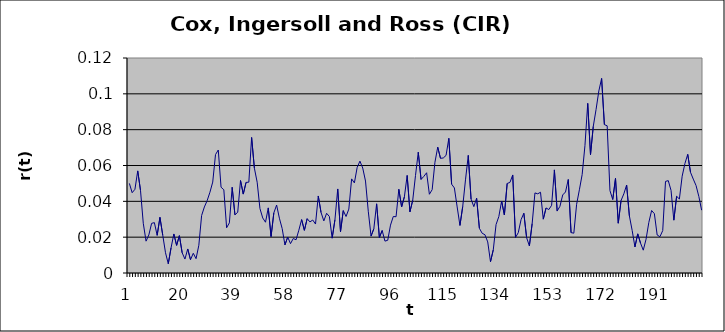
| Category | Series 0 |
|---|---|
| 0 | 0.05 |
| 1 | 0.045 |
| 2 | 0.047 |
| 3 | 0.057 |
| 4 | 0.046 |
| 5 | 0.028 |
| 6 | 0.018 |
| 7 | 0.021 |
| 8 | 0.028 |
| 9 | 0.028 |
| 10 | 0.021 |
| 11 | 0.031 |
| 12 | 0.021 |
| 13 | 0.011 |
| 14 | 0.005 |
| 15 | 0.014 |
| 16 | 0.022 |
| 17 | 0.015 |
| 18 | 0.021 |
| 19 | 0.011 |
| 20 | 0.008 |
| 21 | 0.013 |
| 22 | 0.007 |
| 23 | 0.011 |
| 24 | 0.008 |
| 25 | 0.015 |
| 26 | 0.032 |
| 27 | 0.037 |
| 28 | 0.04 |
| 29 | 0.045 |
| 30 | 0.051 |
| 31 | 0.066 |
| 32 | 0.069 |
| 33 | 0.048 |
| 34 | 0.046 |
| 35 | 0.025 |
| 36 | 0.028 |
| 37 | 0.048 |
| 38 | 0.032 |
| 39 | 0.034 |
| 40 | 0.052 |
| 41 | 0.044 |
| 42 | 0.051 |
| 43 | 0.051 |
| 44 | 0.076 |
| 45 | 0.059 |
| 46 | 0.051 |
| 47 | 0.036 |
| 48 | 0.031 |
| 49 | 0.028 |
| 50 | 0.036 |
| 51 | 0.02 |
| 52 | 0.034 |
| 53 | 0.038 |
| 54 | 0.031 |
| 55 | 0.025 |
| 56 | 0.016 |
| 57 | 0.02 |
| 58 | 0.016 |
| 59 | 0.019 |
| 60 | 0.019 |
| 61 | 0.024 |
| 62 | 0.03 |
| 63 | 0.024 |
| 64 | 0.03 |
| 65 | 0.029 |
| 66 | 0.03 |
| 67 | 0.027 |
| 68 | 0.043 |
| 69 | 0.034 |
| 70 | 0.029 |
| 71 | 0.033 |
| 72 | 0.032 |
| 73 | 0.019 |
| 74 | 0.03 |
| 75 | 0.047 |
| 76 | 0.023 |
| 77 | 0.035 |
| 78 | 0.032 |
| 79 | 0.036 |
| 80 | 0.053 |
| 81 | 0.05 |
| 82 | 0.059 |
| 83 | 0.062 |
| 84 | 0.059 |
| 85 | 0.051 |
| 86 | 0.034 |
| 87 | 0.021 |
| 88 | 0.025 |
| 89 | 0.039 |
| 90 | 0.02 |
| 91 | 0.024 |
| 92 | 0.018 |
| 93 | 0.018 |
| 94 | 0.027 |
| 95 | 0.032 |
| 96 | 0.031 |
| 97 | 0.047 |
| 98 | 0.037 |
| 99 | 0.042 |
| 100 | 0.054 |
| 101 | 0.034 |
| 102 | 0.041 |
| 103 | 0.054 |
| 104 | 0.067 |
| 105 | 0.052 |
| 106 | 0.054 |
| 107 | 0.056 |
| 108 | 0.044 |
| 109 | 0.047 |
| 110 | 0.062 |
| 111 | 0.07 |
| 112 | 0.064 |
| 113 | 0.064 |
| 114 | 0.066 |
| 115 | 0.075 |
| 116 | 0.05 |
| 117 | 0.047 |
| 118 | 0.037 |
| 119 | 0.027 |
| 120 | 0.037 |
| 121 | 0.052 |
| 122 | 0.066 |
| 123 | 0.041 |
| 124 | 0.037 |
| 125 | 0.042 |
| 126 | 0.025 |
| 127 | 0.022 |
| 128 | 0.021 |
| 129 | 0.017 |
| 130 | 0.006 |
| 131 | 0.013 |
| 132 | 0.027 |
| 133 | 0.032 |
| 134 | 0.04 |
| 135 | 0.032 |
| 136 | 0.05 |
| 137 | 0.051 |
| 138 | 0.055 |
| 139 | 0.02 |
| 140 | 0.023 |
| 141 | 0.03 |
| 142 | 0.033 |
| 143 | 0.02 |
| 144 | 0.015 |
| 145 | 0.028 |
| 146 | 0.045 |
| 147 | 0.044 |
| 148 | 0.045 |
| 149 | 0.03 |
| 150 | 0.036 |
| 151 | 0.035 |
| 152 | 0.038 |
| 153 | 0.058 |
| 154 | 0.035 |
| 155 | 0.037 |
| 156 | 0.044 |
| 157 | 0.045 |
| 158 | 0.052 |
| 159 | 0.023 |
| 160 | 0.022 |
| 161 | 0.038 |
| 162 | 0.046 |
| 163 | 0.055 |
| 164 | 0.071 |
| 165 | 0.095 |
| 166 | 0.066 |
| 167 | 0.082 |
| 168 | 0.091 |
| 169 | 0.102 |
| 170 | 0.109 |
| 171 | 0.083 |
| 172 | 0.082 |
| 173 | 0.046 |
| 174 | 0.041 |
| 175 | 0.053 |
| 176 | 0.028 |
| 177 | 0.04 |
| 178 | 0.044 |
| 179 | 0.049 |
| 180 | 0.032 |
| 181 | 0.024 |
| 182 | 0.015 |
| 183 | 0.022 |
| 184 | 0.017 |
| 185 | 0.013 |
| 186 | 0.019 |
| 187 | 0.028 |
| 188 | 0.035 |
| 189 | 0.033 |
| 190 | 0.021 |
| 191 | 0.02 |
| 192 | 0.024 |
| 193 | 0.051 |
| 194 | 0.052 |
| 195 | 0.046 |
| 196 | 0.029 |
| 197 | 0.043 |
| 198 | 0.041 |
| 199 | 0.054 |
| 200 | 0.061 |
| 201 | 0.066 |
| 202 | 0.056 |
| 203 | 0.052 |
| 204 | 0.049 |
| 205 | 0.043 |
| 206 | 0.035 |